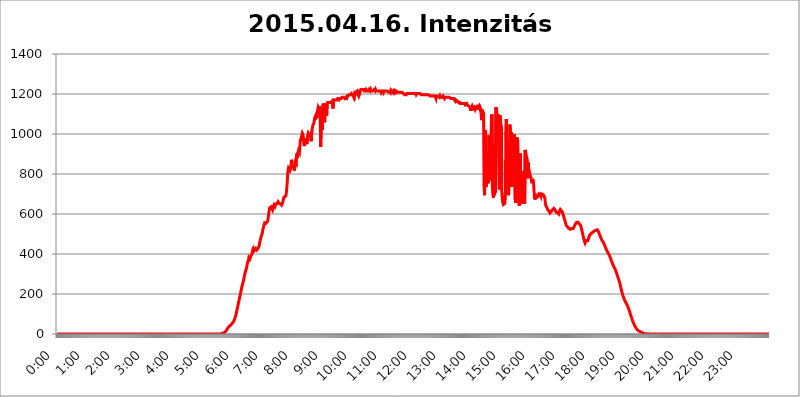
| Category | 2015.04.16. Intenzitás [W/m^2] |
|---|---|
| 0.0 | -0.256 |
| 0.0006944444444444445 | -0.256 |
| 0.001388888888888889 | -0.256 |
| 0.0020833333333333333 | -0.256 |
| 0.002777777777777778 | -0.256 |
| 0.003472222222222222 | -0.256 |
| 0.004166666666666667 | -0.256 |
| 0.004861111111111111 | -0.256 |
| 0.005555555555555556 | -0.256 |
| 0.0062499999999999995 | -0.256 |
| 0.006944444444444444 | -0.256 |
| 0.007638888888888889 | -0.256 |
| 0.008333333333333333 | -0.256 |
| 0.009027777777777779 | -0.256 |
| 0.009722222222222222 | -0.256 |
| 0.010416666666666666 | -0.256 |
| 0.011111111111111112 | -0.256 |
| 0.011805555555555555 | -0.256 |
| 0.012499999999999999 | -0.256 |
| 0.013194444444444444 | -0.256 |
| 0.013888888888888888 | -0.256 |
| 0.014583333333333332 | -0.256 |
| 0.015277777777777777 | -0.256 |
| 0.015972222222222224 | -0.256 |
| 0.016666666666666666 | -0.256 |
| 0.017361111111111112 | -0.256 |
| 0.018055555555555557 | -0.256 |
| 0.01875 | -0.256 |
| 0.019444444444444445 | -0.256 |
| 0.02013888888888889 | -0.256 |
| 0.020833333333333332 | -0.256 |
| 0.02152777777777778 | -0.256 |
| 0.022222222222222223 | -0.256 |
| 0.02291666666666667 | -0.256 |
| 0.02361111111111111 | -0.256 |
| 0.024305555555555556 | -0.256 |
| 0.024999999999999998 | -0.256 |
| 0.025694444444444447 | -0.256 |
| 0.02638888888888889 | -0.256 |
| 0.027083333333333334 | -0.256 |
| 0.027777777777777776 | -0.256 |
| 0.02847222222222222 | -0.256 |
| 0.029166666666666664 | -0.256 |
| 0.029861111111111113 | -0.256 |
| 0.030555555555555555 | -0.256 |
| 0.03125 | -0.256 |
| 0.03194444444444445 | -0.256 |
| 0.03263888888888889 | -0.256 |
| 0.03333333333333333 | -0.256 |
| 0.034027777777777775 | -0.256 |
| 0.034722222222222224 | -0.256 |
| 0.035416666666666666 | -0.256 |
| 0.036111111111111115 | -0.256 |
| 0.03680555555555556 | -0.256 |
| 0.0375 | -0.256 |
| 0.03819444444444444 | -0.256 |
| 0.03888888888888889 | -0.256 |
| 0.03958333333333333 | -0.256 |
| 0.04027777777777778 | -0.256 |
| 0.04097222222222222 | -0.256 |
| 0.041666666666666664 | -0.256 |
| 0.042361111111111106 | -0.256 |
| 0.04305555555555556 | -0.256 |
| 0.043750000000000004 | -0.256 |
| 0.044444444444444446 | -0.256 |
| 0.04513888888888889 | -0.256 |
| 0.04583333333333334 | -0.256 |
| 0.04652777777777778 | -0.256 |
| 0.04722222222222222 | -0.256 |
| 0.04791666666666666 | -0.256 |
| 0.04861111111111111 | -0.256 |
| 0.049305555555555554 | -0.256 |
| 0.049999999999999996 | -0.256 |
| 0.05069444444444445 | -0.256 |
| 0.051388888888888894 | -0.256 |
| 0.052083333333333336 | -0.256 |
| 0.05277777777777778 | -0.256 |
| 0.05347222222222222 | -0.256 |
| 0.05416666666666667 | -0.256 |
| 0.05486111111111111 | -0.256 |
| 0.05555555555555555 | -0.256 |
| 0.05625 | -0.256 |
| 0.05694444444444444 | -0.256 |
| 0.057638888888888885 | -0.256 |
| 0.05833333333333333 | -0.256 |
| 0.05902777777777778 | -0.256 |
| 0.059722222222222225 | -0.256 |
| 0.06041666666666667 | -0.256 |
| 0.061111111111111116 | -0.256 |
| 0.06180555555555556 | -0.256 |
| 0.0625 | -0.256 |
| 0.06319444444444444 | -0.256 |
| 0.06388888888888888 | -0.256 |
| 0.06458333333333334 | -0.256 |
| 0.06527777777777778 | -0.256 |
| 0.06597222222222222 | -0.256 |
| 0.06666666666666667 | -0.256 |
| 0.06736111111111111 | -0.256 |
| 0.06805555555555555 | -0.256 |
| 0.06874999999999999 | -0.256 |
| 0.06944444444444443 | -0.256 |
| 0.07013888888888889 | -0.256 |
| 0.07083333333333333 | -0.256 |
| 0.07152777777777779 | -0.256 |
| 0.07222222222222223 | -0.256 |
| 0.07291666666666667 | -0.256 |
| 0.07361111111111111 | -0.256 |
| 0.07430555555555556 | -0.256 |
| 0.075 | -0.256 |
| 0.07569444444444444 | -0.256 |
| 0.0763888888888889 | -0.256 |
| 0.07708333333333334 | -0.256 |
| 0.07777777777777778 | -0.256 |
| 0.07847222222222222 | -0.256 |
| 0.07916666666666666 | -0.256 |
| 0.0798611111111111 | -0.256 |
| 0.08055555555555556 | -0.256 |
| 0.08125 | -0.256 |
| 0.08194444444444444 | -0.256 |
| 0.08263888888888889 | -0.256 |
| 0.08333333333333333 | -0.256 |
| 0.08402777777777777 | -0.256 |
| 0.08472222222222221 | -0.256 |
| 0.08541666666666665 | -0.256 |
| 0.08611111111111112 | -0.256 |
| 0.08680555555555557 | -0.256 |
| 0.08750000000000001 | -0.256 |
| 0.08819444444444445 | -0.256 |
| 0.08888888888888889 | -0.256 |
| 0.08958333333333333 | -0.256 |
| 0.09027777777777778 | -0.256 |
| 0.09097222222222222 | -0.256 |
| 0.09166666666666667 | -0.256 |
| 0.09236111111111112 | -0.256 |
| 0.09305555555555556 | -0.256 |
| 0.09375 | -0.256 |
| 0.09444444444444444 | -0.256 |
| 0.09513888888888888 | -0.256 |
| 0.09583333333333333 | -0.256 |
| 0.09652777777777777 | -0.256 |
| 0.09722222222222222 | -0.256 |
| 0.09791666666666667 | -0.256 |
| 0.09861111111111111 | -0.256 |
| 0.09930555555555555 | -0.256 |
| 0.09999999999999999 | -0.256 |
| 0.10069444444444443 | -0.256 |
| 0.1013888888888889 | -0.256 |
| 0.10208333333333335 | -0.256 |
| 0.10277777777777779 | -0.256 |
| 0.10347222222222223 | -0.256 |
| 0.10416666666666667 | -0.256 |
| 0.10486111111111111 | -0.256 |
| 0.10555555555555556 | -0.256 |
| 0.10625 | -0.256 |
| 0.10694444444444444 | -0.256 |
| 0.1076388888888889 | -0.256 |
| 0.10833333333333334 | -0.256 |
| 0.10902777777777778 | -0.256 |
| 0.10972222222222222 | -0.256 |
| 0.1111111111111111 | -0.256 |
| 0.11180555555555556 | -0.256 |
| 0.11180555555555556 | -0.256 |
| 0.1125 | -0.256 |
| 0.11319444444444444 | -0.256 |
| 0.11388888888888889 | -0.256 |
| 0.11458333333333333 | -0.256 |
| 0.11527777777777777 | -0.256 |
| 0.11597222222222221 | -0.256 |
| 0.11666666666666665 | -0.256 |
| 0.1173611111111111 | -0.256 |
| 0.11805555555555557 | -0.256 |
| 0.11944444444444445 | -0.256 |
| 0.12013888888888889 | -0.256 |
| 0.12083333333333333 | -0.256 |
| 0.12152777777777778 | -0.256 |
| 0.12222222222222223 | -0.256 |
| 0.12291666666666667 | -0.256 |
| 0.12291666666666667 | -0.256 |
| 0.12361111111111112 | -0.256 |
| 0.12430555555555556 | -0.256 |
| 0.125 | -0.256 |
| 0.12569444444444444 | -0.256 |
| 0.12638888888888888 | -0.256 |
| 0.12708333333333333 | -0.256 |
| 0.16875 | -0.256 |
| 0.12847222222222224 | -0.256 |
| 0.12916666666666668 | -0.256 |
| 0.12986111111111112 | -0.256 |
| 0.13055555555555556 | -0.256 |
| 0.13125 | -0.256 |
| 0.13194444444444445 | -0.256 |
| 0.1326388888888889 | -0.256 |
| 0.13333333333333333 | -0.256 |
| 0.13402777777777777 | -0.256 |
| 0.13402777777777777 | -0.256 |
| 0.13472222222222222 | -0.256 |
| 0.13541666666666666 | -0.256 |
| 0.1361111111111111 | -0.256 |
| 0.13749999999999998 | -0.256 |
| 0.13819444444444443 | -0.256 |
| 0.1388888888888889 | -0.256 |
| 0.13958333333333334 | -0.256 |
| 0.14027777777777778 | -0.256 |
| 0.14097222222222222 | -0.256 |
| 0.14166666666666666 | -0.256 |
| 0.1423611111111111 | -0.256 |
| 0.14305555555555557 | -0.256 |
| 0.14375000000000002 | -0.256 |
| 0.14444444444444446 | -0.256 |
| 0.1451388888888889 | -0.256 |
| 0.1451388888888889 | -0.256 |
| 0.14652777777777778 | -0.256 |
| 0.14722222222222223 | -0.256 |
| 0.14791666666666667 | -0.256 |
| 0.1486111111111111 | -0.256 |
| 0.14930555555555555 | -0.256 |
| 0.15 | -0.256 |
| 0.15069444444444444 | -0.256 |
| 0.15138888888888888 | -0.256 |
| 0.15208333333333332 | -0.256 |
| 0.15277777777777776 | -0.256 |
| 0.15347222222222223 | -0.256 |
| 0.15416666666666667 | -0.256 |
| 0.15486111111111112 | -0.256 |
| 0.15555555555555556 | -0.256 |
| 0.15625 | -0.256 |
| 0.15694444444444444 | -0.256 |
| 0.15763888888888888 | -0.256 |
| 0.15833333333333333 | -0.256 |
| 0.15902777777777777 | -0.256 |
| 0.15972222222222224 | -0.256 |
| 0.16041666666666668 | -0.256 |
| 0.16111111111111112 | -0.256 |
| 0.16180555555555556 | -0.256 |
| 0.1625 | -0.256 |
| 0.16319444444444445 | -0.256 |
| 0.1638888888888889 | -0.256 |
| 0.16458333333333333 | -0.256 |
| 0.16527777777777777 | -0.256 |
| 0.16597222222222222 | -0.256 |
| 0.16666666666666666 | -0.256 |
| 0.1673611111111111 | -0.256 |
| 0.16805555555555554 | -0.256 |
| 0.16874999999999998 | -0.256 |
| 0.16944444444444443 | -0.256 |
| 0.17013888888888887 | -0.256 |
| 0.1708333333333333 | -0.256 |
| 0.17152777777777775 | -0.256 |
| 0.17222222222222225 | -0.256 |
| 0.1729166666666667 | -0.256 |
| 0.17361111111111113 | -0.256 |
| 0.17430555555555557 | -0.256 |
| 0.17500000000000002 | -0.256 |
| 0.17569444444444446 | -0.256 |
| 0.1763888888888889 | -0.256 |
| 0.17708333333333334 | -0.256 |
| 0.17777777777777778 | -0.256 |
| 0.17847222222222223 | -0.256 |
| 0.17916666666666667 | -0.256 |
| 0.1798611111111111 | -0.256 |
| 0.18055555555555555 | -0.256 |
| 0.18125 | -0.256 |
| 0.18194444444444444 | -0.256 |
| 0.1826388888888889 | -0.256 |
| 0.18333333333333335 | -0.256 |
| 0.1840277777777778 | -0.256 |
| 0.18472222222222223 | -0.256 |
| 0.18541666666666667 | -0.256 |
| 0.18611111111111112 | -0.256 |
| 0.18680555555555556 | -0.256 |
| 0.1875 | -0.256 |
| 0.18819444444444444 | -0.256 |
| 0.18888888888888888 | -0.256 |
| 0.18958333333333333 | -0.256 |
| 0.19027777777777777 | -0.256 |
| 0.1909722222222222 | -0.256 |
| 0.19166666666666665 | -0.256 |
| 0.19236111111111112 | -0.256 |
| 0.19305555555555554 | -0.256 |
| 0.19375 | -0.256 |
| 0.19444444444444445 | -0.256 |
| 0.1951388888888889 | -0.256 |
| 0.19583333333333333 | -0.256 |
| 0.19652777777777777 | -0.256 |
| 0.19722222222222222 | -0.256 |
| 0.19791666666666666 | -0.256 |
| 0.1986111111111111 | -0.256 |
| 0.19930555555555554 | -0.256 |
| 0.19999999999999998 | -0.256 |
| 0.20069444444444443 | -0.256 |
| 0.20138888888888887 | -0.256 |
| 0.2020833333333333 | -0.256 |
| 0.2027777777777778 | -0.256 |
| 0.2034722222222222 | -0.256 |
| 0.2041666666666667 | -0.256 |
| 0.20486111111111113 | -0.256 |
| 0.20555555555555557 | -0.256 |
| 0.20625000000000002 | -0.256 |
| 0.20694444444444446 | -0.256 |
| 0.2076388888888889 | -0.256 |
| 0.20833333333333334 | -0.256 |
| 0.20902777777777778 | -0.256 |
| 0.20972222222222223 | -0.256 |
| 0.21041666666666667 | -0.256 |
| 0.2111111111111111 | -0.256 |
| 0.21180555555555555 | -0.256 |
| 0.2125 | -0.256 |
| 0.21319444444444444 | -0.256 |
| 0.2138888888888889 | -0.256 |
| 0.21458333333333335 | -0.256 |
| 0.2152777777777778 | -0.256 |
| 0.21597222222222223 | -0.256 |
| 0.21666666666666667 | -0.256 |
| 0.21736111111111112 | -0.256 |
| 0.21805555555555556 | -0.256 |
| 0.21875 | -0.256 |
| 0.21944444444444444 | -0.256 |
| 0.22013888888888888 | -0.256 |
| 0.22083333333333333 | -0.256 |
| 0.22152777777777777 | -0.256 |
| 0.2222222222222222 | -0.256 |
| 0.22291666666666665 | -0.256 |
| 0.2236111111111111 | -0.256 |
| 0.22430555555555556 | -0.256 |
| 0.225 | -0.256 |
| 0.22569444444444445 | -0.256 |
| 0.2263888888888889 | -0.256 |
| 0.22708333333333333 | -0.256 |
| 0.22777777777777777 | 1.09 |
| 0.22847222222222222 | 1.09 |
| 0.22916666666666666 | 1.09 |
| 0.2298611111111111 | 1.09 |
| 0.23055555555555554 | 2.439 |
| 0.23124999999999998 | 2.439 |
| 0.23194444444444443 | 3.791 |
| 0.23263888888888887 | 3.791 |
| 0.2333333333333333 | 5.146 |
| 0.2340277777777778 | 6.503 |
| 0.2347222222222222 | 7.862 |
| 0.2354166666666667 | 10.589 |
| 0.23611111111111113 | 13.325 |
| 0.23680555555555557 | 16.069 |
| 0.23750000000000002 | 20.201 |
| 0.23819444444444446 | 24.35 |
| 0.2388888888888889 | 28.514 |
| 0.23958333333333334 | 31.297 |
| 0.24027777777777778 | 35.483 |
| 0.24097222222222223 | 38.28 |
| 0.24166666666666667 | 39.68 |
| 0.2423611111111111 | 42.483 |
| 0.24305555555555555 | 43.886 |
| 0.24375 | 45.29 |
| 0.24444444444444446 | 49.507 |
| 0.24513888888888888 | 52.322 |
| 0.24583333333333335 | 55.139 |
| 0.2465277777777778 | 59.368 |
| 0.24722222222222223 | 62.189 |
| 0.24791666666666667 | 67.835 |
| 0.24861111111111112 | 73.481 |
| 0.24930555555555556 | 80.536 |
| 0.25 | 88.991 |
| 0.25069444444444444 | 97.427 |
| 0.2513888888888889 | 108.629 |
| 0.2520833333333333 | 119.766 |
| 0.25277777777777777 | 132.196 |
| 0.2534722222222222 | 143.144 |
| 0.25416666666666665 | 156.678 |
| 0.2548611111111111 | 167.374 |
| 0.2555555555555556 | 179.258 |
| 0.25625000000000003 | 189.685 |
| 0.2569444444444445 | 201.258 |
| 0.2576388888888889 | 212.664 |
| 0.25833333333333336 | 225.146 |
| 0.2590277777777778 | 237.433 |
| 0.25972222222222224 | 245.925 |
| 0.2604166666666667 | 255.528 |
| 0.2611111111111111 | 266.216 |
| 0.26180555555555557 | 277.967 |
| 0.2625 | 290.777 |
| 0.26319444444444445 | 302.353 |
| 0.2638888888888889 | 311.594 |
| 0.26458333333333334 | 320.84 |
| 0.2652777777777778 | 327.793 |
| 0.2659722222222222 | 339.449 |
| 0.26666666666666666 | 354.805 |
| 0.2673611111111111 | 359.595 |
| 0.26805555555555555 | 368.07 |
| 0.26875 | 381.674 |
| 0.26944444444444443 | 381.674 |
| 0.2701388888888889 | 374.206 |
| 0.2708333333333333 | 379.171 |
| 0.27152777777777776 | 389.27 |
| 0.2722222222222222 | 393.122 |
| 0.27291666666666664 | 398.318 |
| 0.2736111111111111 | 410.283 |
| 0.2743055555555555 | 422.678 |
| 0.27499999999999997 | 428.341 |
| 0.27569444444444446 | 422.678 |
| 0.27638888888888885 | 417.112 |
| 0.27708333333333335 | 412.998 |
| 0.2777777777777778 | 421.278 |
| 0.27847222222222223 | 426.916 |
| 0.2791666666666667 | 422.678 |
| 0.2798611111111111 | 419.883 |
| 0.28055555555555556 | 422.678 |
| 0.28125 | 425.497 |
| 0.28194444444444444 | 429.773 |
| 0.2826388888888889 | 435.566 |
| 0.2833333333333333 | 444.463 |
| 0.28402777777777777 | 458.318 |
| 0.2847222222222222 | 469.557 |
| 0.28541666666666665 | 479.541 |
| 0.28611111111111115 | 489.873 |
| 0.28680555555555554 | 495.176 |
| 0.28750000000000003 | 502.396 |
| 0.2881944444444445 | 517.375 |
| 0.2888888888888889 | 531.108 |
| 0.28958333333333336 | 539.234 |
| 0.2902777777777778 | 547.572 |
| 0.29097222222222224 | 556.131 |
| 0.2916666666666667 | 558.305 |
| 0.2923611111111111 | 558.305 |
| 0.29305555555555557 | 553.97 |
| 0.29375 | 551.823 |
| 0.29444444444444445 | 556.131 |
| 0.2951388888888889 | 564.917 |
| 0.29583333333333334 | 580.866 |
| 0.2965277777777778 | 600.035 |
| 0.2972222222222222 | 617.682 |
| 0.29791666666666666 | 630.814 |
| 0.2986111111111111 | 633.495 |
| 0.29930555555555555 | 633.495 |
| 0.3 | 636.194 |
| 0.30069444444444443 | 638.912 |
| 0.3013888888888889 | 638.912 |
| 0.3020833333333333 | 620.273 |
| 0.30277777777777776 | 628.152 |
| 0.3034722222222222 | 641.649 |
| 0.30416666666666664 | 647.179 |
| 0.3048611111111111 | 644.405 |
| 0.3055555555555555 | 638.912 |
| 0.30624999999999997 | 647.179 |
| 0.3069444444444444 | 649.973 |
| 0.3076388888888889 | 649.973 |
| 0.30833333333333335 | 652.786 |
| 0.3090277777777778 | 655.618 |
| 0.30972222222222223 | 661.343 |
| 0.3104166666666667 | 658.471 |
| 0.3111111111111111 | 652.786 |
| 0.31180555555555556 | 655.618 |
| 0.3125 | 652.786 |
| 0.31319444444444444 | 649.973 |
| 0.3138888888888889 | 647.179 |
| 0.3145833333333333 | 644.405 |
| 0.31527777777777777 | 649.973 |
| 0.3159722222222222 | 649.973 |
| 0.31666666666666665 | 664.234 |
| 0.31736111111111115 | 676.003 |
| 0.31805555555555554 | 685.046 |
| 0.31875000000000003 | 688.102 |
| 0.3194444444444445 | 688.102 |
| 0.3201388888888889 | 688.102 |
| 0.32083333333333336 | 694.278 |
| 0.3215277777777778 | 713.328 |
| 0.32222222222222224 | 739.988 |
| 0.3229166666666667 | 782.842 |
| 0.3236111111111111 | 817.382 |
| 0.32430555555555557 | 829.377 |
| 0.325 | 833.43 |
| 0.32569444444444445 | 829.377 |
| 0.3263888888888889 | 817.382 |
| 0.32708333333333334 | 825.351 |
| 0.3277777777777778 | 841.619 |
| 0.3284722222222222 | 871.173 |
| 0.32916666666666666 | 854.113 |
| 0.3298611111111111 | 849.92 |
| 0.33055555555555555 | 833.43 |
| 0.33125 | 849.92 |
| 0.33194444444444443 | 825.351 |
| 0.3326388888888889 | 817.382 |
| 0.3333333333333333 | 845.755 |
| 0.3340277777777778 | 871.173 |
| 0.3347222222222222 | 837.51 |
| 0.3354166666666667 | 884.274 |
| 0.3361111111111111 | 902.16 |
| 0.3368055555555556 | 879.878 |
| 0.33749999999999997 | 906.707 |
| 0.33819444444444446 | 915.893 |
| 0.33888888888888885 | 911.285 |
| 0.33958333333333335 | 906.707 |
| 0.34027777777777773 | 939.404 |
| 0.34097222222222223 | 968.671 |
| 0.3416666666666666 | 973.663 |
| 0.3423611111111111 | 983.747 |
| 0.3430555555555555 | 993.965 |
| 0.34375 | 1004.318 |
| 0.3444444444444445 | 999.125 |
| 0.3451388888888889 | 983.747 |
| 0.3458333333333334 | 953.892 |
| 0.34652777777777777 | 939.404 |
| 0.34722222222222227 | 939.404 |
| 0.34791666666666665 | 978.688 |
| 0.34861111111111115 | 968.671 |
| 0.34930555555555554 | 963.712 |
| 0.35000000000000003 | 949.03 |
| 0.3506944444444444 | 953.892 |
| 0.3513888888888889 | 953.892 |
| 0.3520833333333333 | 1004.318 |
| 0.3527777777777778 | 1004.318 |
| 0.3534722222222222 | 1004.318 |
| 0.3541666666666667 | 993.965 |
| 0.3548611111111111 | 993.965 |
| 0.35555555555555557 | 999.125 |
| 0.35625 | 963.712 |
| 0.35694444444444445 | 1014.809 |
| 0.3576388888888889 | 1025.437 |
| 0.35833333333333334 | 1041.644 |
| 0.3590277777777778 | 1047.117 |
| 0.3597222222222222 | 1052.625 |
| 0.36041666666666666 | 1063.751 |
| 0.3611111111111111 | 1080.711 |
| 0.36180555555555555 | 1080.711 |
| 0.3625 | 1092.203 |
| 0.36319444444444443 | 1080.711 |
| 0.3638888888888889 | 1080.711 |
| 0.3645833333333333 | 1086.439 |
| 0.3652777777777778 | 1121.587 |
| 0.3659722222222222 | 1133.607 |
| 0.3666666666666667 | 1127.578 |
| 0.3673611111111111 | 1127.578 |
| 0.3680555555555556 | 1139.675 |
| 0.36874999999999997 | 1080.711 |
| 0.36944444444444446 | 934.639 |
| 0.37013888888888885 | 1030.804 |
| 0.37083333333333335 | 1041.644 |
| 0.37152777777777773 | 1020.106 |
| 0.37222222222222223 | 1127.578 |
| 0.3729166666666666 | 1151.928 |
| 0.3736111111111111 | 1127.578 |
| 0.3743055555555555 | 1069.368 |
| 0.375 | 1058.17 |
| 0.3756944444444445 | 1151.928 |
| 0.3763888888888889 | 1151.928 |
| 0.3770833333333334 | 1151.928 |
| 0.37777777777777777 | 1092.203 |
| 0.37847222222222227 | 1151.928 |
| 0.37916666666666665 | 1158.113 |
| 0.37986111111111115 | 1158.113 |
| 0.38055555555555554 | 1158.113 |
| 0.38125000000000003 | 1158.113 |
| 0.3819444444444444 | 1158.113 |
| 0.3826388888888889 | 1158.113 |
| 0.3833333333333333 | 1158.113 |
| 0.3840277777777778 | 1158.113 |
| 0.3847222222222222 | 1158.113 |
| 0.3854166666666667 | 1164.337 |
| 0.3861111111111111 | 1164.337 |
| 0.38680555555555557 | 1127.578 |
| 0.3875 | 1170.601 |
| 0.38819444444444445 | 1170.601 |
| 0.3888888888888889 | 1170.601 |
| 0.38958333333333334 | 1170.601 |
| 0.3902777777777778 | 1170.601 |
| 0.3909722222222222 | 1170.601 |
| 0.39166666666666666 | 1170.601 |
| 0.3923611111111111 | 1170.601 |
| 0.39305555555555555 | 1176.905 |
| 0.39375 | 1176.905 |
| 0.39444444444444443 | 1176.905 |
| 0.3951388888888889 | 1170.601 |
| 0.3958333333333333 | 1176.905 |
| 0.3965277777777778 | 1176.905 |
| 0.3972222222222222 | 1176.905 |
| 0.3979166666666667 | 1176.905 |
| 0.3986111111111111 | 1176.905 |
| 0.3993055555555556 | 1183.249 |
| 0.39999999999999997 | 1183.249 |
| 0.40069444444444446 | 1183.249 |
| 0.40138888888888885 | 1183.249 |
| 0.40208333333333335 | 1183.249 |
| 0.40277777777777773 | 1183.249 |
| 0.40347222222222223 | 1176.905 |
| 0.4041666666666666 | 1176.905 |
| 0.4048611111111111 | 1183.249 |
| 0.4055555555555555 | 1170.601 |
| 0.40625 | 1183.249 |
| 0.4069444444444445 | 1183.249 |
| 0.4076388888888889 | 1189.633 |
| 0.4083333333333334 | 1189.633 |
| 0.40902777777777777 | 1196.058 |
| 0.40972222222222227 | 1196.058 |
| 0.41041666666666665 | 1196.058 |
| 0.41111111111111115 | 1196.058 |
| 0.41180555555555554 | 1196.058 |
| 0.41250000000000003 | 1202.523 |
| 0.4131944444444444 | 1202.523 |
| 0.4138888888888889 | 1196.058 |
| 0.4145833333333333 | 1196.058 |
| 0.4152777777777778 | 1189.633 |
| 0.4159722222222222 | 1183.249 |
| 0.4166666666666667 | 1196.058 |
| 0.4173611111111111 | 1189.633 |
| 0.41805555555555557 | 1202.523 |
| 0.41875 | 1209.029 |
| 0.41944444444444445 | 1209.029 |
| 0.4201388888888889 | 1209.029 |
| 0.42083333333333334 | 1215.576 |
| 0.4215277777777778 | 1209.029 |
| 0.4222222222222222 | 1196.058 |
| 0.42291666666666666 | 1189.633 |
| 0.4236111111111111 | 1189.633 |
| 0.42430555555555555 | 1202.523 |
| 0.425 | 1215.576 |
| 0.42569444444444443 | 1222.164 |
| 0.4263888888888889 | 1222.164 |
| 0.4270833333333333 | 1222.164 |
| 0.4277777777777778 | 1222.164 |
| 0.4284722222222222 | 1222.164 |
| 0.4291666666666667 | 1222.164 |
| 0.4298611111111111 | 1222.164 |
| 0.4305555555555556 | 1215.576 |
| 0.43124999999999997 | 1215.576 |
| 0.43194444444444446 | 1215.576 |
| 0.43263888888888885 | 1215.576 |
| 0.43333333333333335 | 1222.164 |
| 0.43402777777777773 | 1222.164 |
| 0.43472222222222223 | 1215.576 |
| 0.4354166666666666 | 1215.576 |
| 0.4361111111111111 | 1215.576 |
| 0.4368055555555555 | 1215.576 |
| 0.4375 | 1222.164 |
| 0.4381944444444445 | 1222.164 |
| 0.4388888888888889 | 1215.576 |
| 0.4395833333333334 | 1222.164 |
| 0.44027777777777777 | 1215.576 |
| 0.44097222222222227 | 1215.576 |
| 0.44166666666666665 | 1215.576 |
| 0.44236111111111115 | 1215.576 |
| 0.44305555555555554 | 1215.576 |
| 0.44375000000000003 | 1215.576 |
| 0.4444444444444444 | 1222.164 |
| 0.4451388888888889 | 1222.164 |
| 0.4458333333333333 | 1215.576 |
| 0.4465277777777778 | 1222.164 |
| 0.4472222222222222 | 1215.576 |
| 0.4479166666666667 | 1215.576 |
| 0.4486111111111111 | 1215.576 |
| 0.44930555555555557 | 1215.576 |
| 0.45 | 1215.576 |
| 0.45069444444444445 | 1215.576 |
| 0.4513888888888889 | 1215.576 |
| 0.45208333333333334 | 1215.576 |
| 0.4527777777777778 | 1215.576 |
| 0.4534722222222222 | 1215.576 |
| 0.45416666666666666 | 1209.029 |
| 0.4548611111111111 | 1215.576 |
| 0.45555555555555555 | 1215.576 |
| 0.45625 | 1215.576 |
| 0.45694444444444443 | 1215.576 |
| 0.4576388888888889 | 1209.029 |
| 0.4583333333333333 | 1215.576 |
| 0.4590277777777778 | 1215.576 |
| 0.4597222222222222 | 1215.576 |
| 0.4604166666666667 | 1215.576 |
| 0.4611111111111111 | 1215.576 |
| 0.4618055555555556 | 1215.576 |
| 0.46249999999999997 | 1215.576 |
| 0.46319444444444446 | 1215.576 |
| 0.46388888888888885 | 1215.576 |
| 0.46458333333333335 | 1209.029 |
| 0.46527777777777773 | 1209.029 |
| 0.46597222222222223 | 1209.029 |
| 0.4666666666666666 | 1209.029 |
| 0.4673611111111111 | 1215.576 |
| 0.4680555555555555 | 1209.029 |
| 0.46875 | 1215.576 |
| 0.4694444444444445 | 1215.576 |
| 0.4701388888888889 | 1209.029 |
| 0.4708333333333334 | 1209.029 |
| 0.47152777777777777 | 1215.576 |
| 0.47222222222222227 | 1209.029 |
| 0.47291666666666665 | 1215.576 |
| 0.47361111111111115 | 1215.576 |
| 0.47430555555555554 | 1209.029 |
| 0.47500000000000003 | 1215.576 |
| 0.4756944444444444 | 1215.576 |
| 0.4763888888888889 | 1215.576 |
| 0.4770833333333333 | 1209.029 |
| 0.4777777777777778 | 1209.029 |
| 0.4784722222222222 | 1209.029 |
| 0.4791666666666667 | 1209.029 |
| 0.4798611111111111 | 1209.029 |
| 0.48055555555555557 | 1209.029 |
| 0.48125 | 1209.029 |
| 0.48194444444444445 | 1209.029 |
| 0.4826388888888889 | 1209.029 |
| 0.48333333333333334 | 1209.029 |
| 0.4840277777777778 | 1209.029 |
| 0.4847222222222222 | 1209.029 |
| 0.48541666666666666 | 1202.523 |
| 0.4861111111111111 | 1202.523 |
| 0.48680555555555555 | 1202.523 |
| 0.4875 | 1196.058 |
| 0.48819444444444443 | 1196.058 |
| 0.4888888888888889 | 1196.058 |
| 0.4895833333333333 | 1196.058 |
| 0.4902777777777778 | 1202.523 |
| 0.4909722222222222 | 1202.523 |
| 0.4916666666666667 | 1202.523 |
| 0.4923611111111111 | 1202.523 |
| 0.4930555555555556 | 1202.523 |
| 0.49374999999999997 | 1202.523 |
| 0.49444444444444446 | 1202.523 |
| 0.49513888888888885 | 1202.523 |
| 0.49583333333333335 | 1202.523 |
| 0.49652777777777773 | 1202.523 |
| 0.49722222222222223 | 1202.523 |
| 0.4979166666666666 | 1202.523 |
| 0.4986111111111111 | 1202.523 |
| 0.4993055555555555 | 1202.523 |
| 0.5 | 1202.523 |
| 0.5006944444444444 | 1202.523 |
| 0.5013888888888889 | 1202.523 |
| 0.5020833333333333 | 1202.523 |
| 0.5027777777777778 | 1202.523 |
| 0.5034722222222222 | 1196.058 |
| 0.5041666666666667 | 1196.058 |
| 0.5048611111111111 | 1202.523 |
| 0.5055555555555555 | 1202.523 |
| 0.50625 | 1202.523 |
| 0.5069444444444444 | 1202.523 |
| 0.5076388888888889 | 1202.523 |
| 0.5083333333333333 | 1202.523 |
| 0.5090277777777777 | 1202.523 |
| 0.5097222222222222 | 1202.523 |
| 0.5104166666666666 | 1196.058 |
| 0.5111111111111112 | 1196.058 |
| 0.5118055555555555 | 1196.058 |
| 0.5125000000000001 | 1196.058 |
| 0.5131944444444444 | 1196.058 |
| 0.513888888888889 | 1196.058 |
| 0.5145833333333333 | 1196.058 |
| 0.5152777777777778 | 1196.058 |
| 0.5159722222222222 | 1196.058 |
| 0.5166666666666667 | 1196.058 |
| 0.517361111111111 | 1196.058 |
| 0.5180555555555556 | 1196.058 |
| 0.5187499999999999 | 1196.058 |
| 0.5194444444444445 | 1196.058 |
| 0.5201388888888888 | 1196.058 |
| 0.5208333333333334 | 1196.058 |
| 0.5215277777777778 | 1196.058 |
| 0.5222222222222223 | 1196.058 |
| 0.5229166666666667 | 1189.633 |
| 0.5236111111111111 | 1189.633 |
| 0.5243055555555556 | 1189.633 |
| 0.525 | 1189.633 |
| 0.5256944444444445 | 1189.633 |
| 0.5263888888888889 | 1189.633 |
| 0.5270833333333333 | 1189.633 |
| 0.5277777777777778 | 1189.633 |
| 0.5284722222222222 | 1189.633 |
| 0.5291666666666667 | 1189.633 |
| 0.5298611111111111 | 1189.633 |
| 0.5305555555555556 | 1183.249 |
| 0.53125 | 1176.905 |
| 0.5319444444444444 | 1189.633 |
| 0.5326388888888889 | 1189.633 |
| 0.5333333333333333 | 1189.633 |
| 0.5340277777777778 | 1189.633 |
| 0.5347222222222222 | 1189.633 |
| 0.5354166666666667 | 1189.633 |
| 0.5361111111111111 | 1183.249 |
| 0.5368055555555555 | 1189.633 |
| 0.5375 | 1183.249 |
| 0.5381944444444444 | 1183.249 |
| 0.5388888888888889 | 1183.249 |
| 0.5395833333333333 | 1183.249 |
| 0.5402777777777777 | 1183.249 |
| 0.5409722222222222 | 1189.633 |
| 0.5416666666666666 | 1183.249 |
| 0.5423611111111112 | 1183.249 |
| 0.5430555555555555 | 1176.905 |
| 0.5437500000000001 | 1183.249 |
| 0.5444444444444444 | 1183.249 |
| 0.545138888888889 | 1183.249 |
| 0.5458333333333333 | 1183.249 |
| 0.5465277777777778 | 1183.249 |
| 0.5472222222222222 | 1183.249 |
| 0.5479166666666667 | 1183.249 |
| 0.548611111111111 | 1183.249 |
| 0.5493055555555556 | 1183.249 |
| 0.5499999999999999 | 1183.249 |
| 0.5506944444444445 | 1183.249 |
| 0.5513888888888888 | 1183.249 |
| 0.5520833333333334 | 1176.905 |
| 0.5527777777777778 | 1176.905 |
| 0.5534722222222223 | 1176.905 |
| 0.5541666666666667 | 1176.905 |
| 0.5548611111111111 | 1176.905 |
| 0.5555555555555556 | 1176.905 |
| 0.55625 | 1176.905 |
| 0.5569444444444445 | 1170.601 |
| 0.5576388888888889 | 1170.601 |
| 0.5583333333333333 | 1164.337 |
| 0.5590277777777778 | 1170.601 |
| 0.5597222222222222 | 1170.601 |
| 0.5604166666666667 | 1170.601 |
| 0.5611111111111111 | 1164.337 |
| 0.5618055555555556 | 1164.337 |
| 0.5625 | 1158.113 |
| 0.5631944444444444 | 1158.113 |
| 0.5638888888888889 | 1158.113 |
| 0.5645833333333333 | 1158.113 |
| 0.5652777777777778 | 1151.928 |
| 0.5659722222222222 | 1151.928 |
| 0.5666666666666667 | 1151.928 |
| 0.5673611111111111 | 1151.928 |
| 0.5680555555555555 | 1151.928 |
| 0.56875 | 1151.928 |
| 0.5694444444444444 | 1151.928 |
| 0.5701388888888889 | 1151.928 |
| 0.5708333333333333 | 1151.928 |
| 0.5715277777777777 | 1151.928 |
| 0.5722222222222222 | 1145.782 |
| 0.5729166666666666 | 1145.782 |
| 0.5736111111111112 | 1145.782 |
| 0.5743055555555555 | 1151.928 |
| 0.5750000000000001 | 1145.782 |
| 0.5756944444444444 | 1145.782 |
| 0.576388888888889 | 1145.782 |
| 0.5770833333333333 | 1139.675 |
| 0.5777777777777778 | 1139.675 |
| 0.5784722222222222 | 1139.675 |
| 0.5791666666666667 | 1133.607 |
| 0.579861111111111 | 1115.634 |
| 0.5805555555555556 | 1139.675 |
| 0.5812499999999999 | 1133.607 |
| 0.5819444444444445 | 1139.675 |
| 0.5826388888888888 | 1139.675 |
| 0.5833333333333334 | 1127.578 |
| 0.5840277777777778 | 1127.578 |
| 0.5847222222222223 | 1133.607 |
| 0.5854166666666667 | 1127.578 |
| 0.5861111111111111 | 1121.587 |
| 0.5868055555555556 | 1127.578 |
| 0.5875 | 1139.675 |
| 0.5881944444444445 | 1121.587 |
| 0.5888888888888889 | 1139.675 |
| 0.5895833333333333 | 1139.675 |
| 0.5902777777777778 | 1139.675 |
| 0.5909722222222222 | 1139.675 |
| 0.5916666666666667 | 1133.607 |
| 0.5923611111111111 | 1139.675 |
| 0.5930555555555556 | 1139.675 |
| 0.59375 | 1127.578 |
| 0.5944444444444444 | 1127.578 |
| 0.5951388888888889 | 1069.368 |
| 0.5958333333333333 | 1121.587 |
| 0.5965277777777778 | 1115.634 |
| 0.5972222222222222 | 1115.634 |
| 0.5979166666666667 | 1103.843 |
| 0.5986111111111111 | 739.988 |
| 0.5993055555555555 | 694.278 |
| 0.6 | 993.965 |
| 0.6006944444444444 | 1020.106 |
| 0.6013888888888889 | 736.574 |
| 0.6020833333333333 | 794.119 |
| 0.6027777777777777 | 897.643 |
| 0.6034722222222222 | 915.893 |
| 0.6041666666666666 | 753.881 |
| 0.6048611111111112 | 790.334 |
| 0.6055555555555555 | 993.965 |
| 0.6062500000000001 | 775.451 |
| 0.6069444444444444 | 768.162 |
| 0.607638888888889 | 825.351 |
| 0.6083333333333333 | 963.712 |
| 0.6090277777777778 | 1086.439 |
| 0.6097222222222222 | 1098.004 |
| 0.6104166666666667 | 729.817 |
| 0.611111111111111 | 694.278 |
| 0.6118055555555556 | 682.011 |
| 0.6124999999999999 | 706.89 |
| 0.6131944444444445 | 694.278 |
| 0.6138888888888888 | 944.201 |
| 0.6145833333333334 | 706.89 |
| 0.6152777777777778 | 1133.607 |
| 0.6159722222222223 | 1121.587 |
| 0.6166666666666667 | 1103.843 |
| 0.6173611111111111 | 1063.751 |
| 0.6180555555555556 | 1069.368 |
| 0.61875 | 1098.004 |
| 0.6194444444444445 | 1098.004 |
| 0.6201388888888889 | 723.153 |
| 0.6208333333333333 | 1092.203 |
| 0.6215277777777778 | 1063.751 |
| 0.6222222222222222 | 1047.117 |
| 0.6229166666666667 | 1036.206 |
| 0.6236111111111111 | 706.89 |
| 0.6243055555555556 | 670.078 |
| 0.625 | 655.618 |
| 0.6256944444444444 | 647.179 |
| 0.6263888888888889 | 647.179 |
| 0.6270833333333333 | 649.973 |
| 0.6277777777777778 | 652.786 |
| 0.6284722222222222 | 688.102 |
| 0.6291666666666667 | 1009.546 |
| 0.6298611111111111 | 1075.021 |
| 0.6305555555555555 | 723.153 |
| 0.63125 | 700.54 |
| 0.6319444444444444 | 779.134 |
| 0.6326388888888889 | 694.278 |
| 0.6333333333333333 | 703.704 |
| 0.6340277777777777 | 706.89 |
| 0.6347222222222222 | 1047.117 |
| 0.6354166666666666 | 1020.106 |
| 0.6361111111111112 | 999.125 |
| 0.6368055555555555 | 1009.546 |
| 0.6375000000000001 | 736.574 |
| 0.6381944444444444 | 849.92 |
| 0.638888888888889 | 978.688 |
| 0.6395833333333333 | 983.747 |
| 0.6402777777777778 | 993.965 |
| 0.6409722222222222 | 999.125 |
| 0.6416666666666667 | 999.125 |
| 0.642361111111111 | 670.078 |
| 0.6430555555555556 | 655.618 |
| 0.6437499999999999 | 678.997 |
| 0.6444444444444445 | 983.747 |
| 0.6451388888888888 | 983.747 |
| 0.6458333333333334 | 963.712 |
| 0.6465277777777778 | 854.113 |
| 0.6472222222222223 | 658.471 |
| 0.6479166666666667 | 641.649 |
| 0.6486111111111111 | 652.786 |
| 0.6493055555555556 | 902.16 |
| 0.65 | 779.134 |
| 0.6506944444444445 | 649.973 |
| 0.6513888888888889 | 678.997 |
| 0.6520833333333333 | 813.439 |
| 0.6527777777777778 | 658.471 |
| 0.6534722222222222 | 649.973 |
| 0.6541666666666667 | 649.973 |
| 0.6548611111111111 | 713.328 |
| 0.6555555555555556 | 652.786 |
| 0.65625 | 920.533 |
| 0.6569444444444444 | 911.285 |
| 0.6576388888888889 | 893.157 |
| 0.6583333333333333 | 884.274 |
| 0.6590277777777778 | 875.511 |
| 0.6597222222222222 | 779.134 |
| 0.6604166666666667 | 858.335 |
| 0.6611111111111111 | 829.377 |
| 0.6618055555555555 | 825.351 |
| 0.6625 | 805.632 |
| 0.6631944444444444 | 801.768 |
| 0.6638888888888889 | 786.575 |
| 0.6645833333333333 | 779.134 |
| 0.6652777777777777 | 779.134 |
| 0.6659722222222222 | 753.881 |
| 0.6666666666666666 | 775.451 |
| 0.6673611111111111 | 779.134 |
| 0.6680555555555556 | 753.881 |
| 0.6687500000000001 | 713.328 |
| 0.6694444444444444 | 673.03 |
| 0.6701388888888888 | 670.078 |
| 0.6708333333333334 | 676.003 |
| 0.6715277777777778 | 688.102 |
| 0.6722222222222222 | 682.011 |
| 0.6729166666666666 | 678.997 |
| 0.6736111111111112 | 678.997 |
| 0.6743055555555556 | 688.102 |
| 0.6749999999999999 | 694.278 |
| 0.6756944444444444 | 700.54 |
| 0.6763888888888889 | 700.54 |
| 0.6770833333333334 | 700.54 |
| 0.6777777777777777 | 694.278 |
| 0.6784722222222223 | 688.102 |
| 0.6791666666666667 | 700.54 |
| 0.6798611111111111 | 700.54 |
| 0.6805555555555555 | 700.54 |
| 0.68125 | 697.399 |
| 0.6819444444444445 | 694.278 |
| 0.6826388888888889 | 691.18 |
| 0.6833333333333332 | 685.046 |
| 0.6840277777777778 | 676.003 |
| 0.6847222222222222 | 652.786 |
| 0.6854166666666667 | 638.912 |
| 0.686111111111111 | 638.912 |
| 0.6868055555555556 | 633.495 |
| 0.6875 | 622.881 |
| 0.6881944444444444 | 622.881 |
| 0.688888888888889 | 622.881 |
| 0.6895833333333333 | 615.11 |
| 0.6902777777777778 | 610.016 |
| 0.6909722222222222 | 604.992 |
| 0.6916666666666668 | 604.992 |
| 0.6923611111111111 | 610.016 |
| 0.6930555555555555 | 612.554 |
| 0.69375 | 617.682 |
| 0.6944444444444445 | 620.273 |
| 0.6951388888888889 | 622.881 |
| 0.6958333333333333 | 622.881 |
| 0.6965277777777777 | 628.152 |
| 0.6972222222222223 | 625.508 |
| 0.6979166666666666 | 622.881 |
| 0.6986111111111111 | 617.682 |
| 0.6993055555555556 | 610.016 |
| 0.7000000000000001 | 607.495 |
| 0.7006944444444444 | 607.495 |
| 0.7013888888888888 | 607.495 |
| 0.7020833333333334 | 604.992 |
| 0.7027777777777778 | 604.992 |
| 0.7034722222222222 | 600.035 |
| 0.7041666666666666 | 604.992 |
| 0.7048611111111112 | 617.682 |
| 0.7055555555555556 | 622.881 |
| 0.7062499999999999 | 622.881 |
| 0.7069444444444444 | 620.273 |
| 0.7076388888888889 | 615.11 |
| 0.7083333333333334 | 610.016 |
| 0.7090277777777777 | 602.505 |
| 0.7097222222222223 | 595.145 |
| 0.7104166666666667 | 587.934 |
| 0.7111111111111111 | 578.542 |
| 0.7118055555555555 | 569.398 |
| 0.7125 | 560.495 |
| 0.7131944444444445 | 551.823 |
| 0.7138888888888889 | 543.376 |
| 0.7145833333333332 | 539.234 |
| 0.7152777777777778 | 537.182 |
| 0.7159722222222222 | 533.12 |
| 0.7166666666666667 | 533.12 |
| 0.717361111111111 | 529.108 |
| 0.7180555555555556 | 527.122 |
| 0.71875 | 525.148 |
| 0.7194444444444444 | 523.186 |
| 0.720138888888889 | 523.186 |
| 0.7208333333333333 | 523.186 |
| 0.7215277777777778 | 527.122 |
| 0.7222222222222222 | 523.186 |
| 0.7229166666666668 | 529.108 |
| 0.7236111111111111 | 527.122 |
| 0.7243055555555555 | 531.108 |
| 0.725 | 537.182 |
| 0.7256944444444445 | 543.376 |
| 0.7263888888888889 | 547.572 |
| 0.7270833333333333 | 551.823 |
| 0.7277777777777777 | 556.131 |
| 0.7284722222222223 | 558.305 |
| 0.7291666666666666 | 560.495 |
| 0.7298611111111111 | 558.305 |
| 0.7305555555555556 | 558.305 |
| 0.7312500000000001 | 556.131 |
| 0.7319444444444444 | 551.823 |
| 0.7326388888888888 | 549.691 |
| 0.7333333333333334 | 547.572 |
| 0.7340277777777778 | 543.376 |
| 0.7347222222222222 | 535.145 |
| 0.7354166666666666 | 523.186 |
| 0.7361111111111112 | 513.561 |
| 0.7368055555555556 | 504.229 |
| 0.7374999999999999 | 491.63 |
| 0.7381944444444444 | 479.541 |
| 0.7388888888888889 | 471.198 |
| 0.7395833333333334 | 461.486 |
| 0.7402777777777777 | 455.184 |
| 0.7409722222222223 | 461.486 |
| 0.7416666666666667 | 461.486 |
| 0.7423611111111111 | 467.925 |
| 0.7430555555555555 | 472.848 |
| 0.74375 | 471.198 |
| 0.7444444444444445 | 467.925 |
| 0.7451388888888889 | 467.925 |
| 0.7458333333333332 | 486.389 |
| 0.7465277777777778 | 493.398 |
| 0.7472222222222222 | 495.176 |
| 0.7479166666666667 | 498.764 |
| 0.748611111111111 | 500.575 |
| 0.7493055555555556 | 504.229 |
| 0.75 | 507.927 |
| 0.7506944444444444 | 507.927 |
| 0.751388888888889 | 509.793 |
| 0.7520833333333333 | 511.671 |
| 0.7527777777777778 | 513.561 |
| 0.7534722222222222 | 515.462 |
| 0.7541666666666668 | 515.462 |
| 0.7548611111111111 | 515.462 |
| 0.7555555555555555 | 519.3 |
| 0.75625 | 523.186 |
| 0.7569444444444445 | 523.186 |
| 0.7576388888888889 | 521.237 |
| 0.7583333333333333 | 517.375 |
| 0.7590277777777777 | 511.671 |
| 0.7597222222222223 | 506.072 |
| 0.7604166666666666 | 498.764 |
| 0.7611111111111111 | 493.398 |
| 0.7618055555555556 | 486.389 |
| 0.7625000000000001 | 481.238 |
| 0.7631944444444444 | 474.507 |
| 0.7638888888888888 | 467.925 |
| 0.7645833333333334 | 464.688 |
| 0.7652777777777778 | 461.486 |
| 0.7659722222222222 | 458.318 |
| 0.7666666666666666 | 453.629 |
| 0.7673611111111112 | 445.971 |
| 0.7680555555555556 | 439.982 |
| 0.7687499999999999 | 434.107 |
| 0.7694444444444444 | 429.773 |
| 0.7701388888888889 | 422.678 |
| 0.7708333333333334 | 417.112 |
| 0.7715277777777777 | 414.364 |
| 0.7722222222222223 | 407.589 |
| 0.7729166666666667 | 403.587 |
| 0.7736111111111111 | 398.318 |
| 0.7743055555555555 | 393.122 |
| 0.775 | 386.723 |
| 0.7756944444444445 | 381.674 |
| 0.7763888888888889 | 374.206 |
| 0.7770833333333332 | 366.851 |
| 0.7777777777777778 | 360.798 |
| 0.7784722222222222 | 353.613 |
| 0.7791666666666667 | 347.682 |
| 0.779861111111111 | 341.794 |
| 0.7805555555555556 | 335.941 |
| 0.78125 | 332.443 |
| 0.7819444444444444 | 327.793 |
| 0.782638888888889 | 321.998 |
| 0.7833333333333333 | 316.215 |
| 0.7840277777777778 | 309.284 |
| 0.7847222222222222 | 302.353 |
| 0.7854166666666668 | 294.255 |
| 0.7861111111111111 | 286.13 |
| 0.7868055555555555 | 279.136 |
| 0.7875 | 272.106 |
| 0.7881944444444445 | 263.851 |
| 0.7888888888888889 | 255.528 |
| 0.7895833333333333 | 245.925 |
| 0.7902777777777777 | 234.99 |
| 0.7909722222222223 | 223.906 |
| 0.7916666666666666 | 212.664 |
| 0.7923611111111111 | 203.807 |
| 0.7930555555555556 | 194.849 |
| 0.7937500000000001 | 188.389 |
| 0.7944444444444444 | 180.569 |
| 0.7951388888888888 | 175.315 |
| 0.7958333333333334 | 168.703 |
| 0.7965277777777778 | 163.378 |
| 0.7972222222222222 | 159.364 |
| 0.7979166666666666 | 153.986 |
| 0.7986111111111112 | 148.579 |
| 0.7993055555555556 | 144.506 |
| 0.7999999999999999 | 139.051 |
| 0.8006944444444444 | 133.57 |
| 0.8013888888888889 | 126.685 |
| 0.8020833333333334 | 118.378 |
| 0.8027777777777777 | 111.42 |
| 0.8034722222222223 | 103.035 |
| 0.8041666666666667 | 96.022 |
| 0.8048611111111111 | 87.583 |
| 0.8055555555555555 | 80.536 |
| 0.80625 | 73.481 |
| 0.8069444444444445 | 66.423 |
| 0.8076388888888889 | 59.368 |
| 0.8083333333333332 | 53.73 |
| 0.8090277777777778 | 48.1 |
| 0.8097222222222222 | 42.483 |
| 0.8104166666666667 | 38.28 |
| 0.811111111111111 | 34.086 |
| 0.8118055555555556 | 29.905 |
| 0.8125 | 25.736 |
| 0.8131944444444444 | 22.965 |
| 0.813888888888889 | 20.201 |
| 0.8145833333333333 | 18.822 |
| 0.8152777777777778 | 16.069 |
| 0.8159722222222222 | 14.696 |
| 0.8166666666666668 | 13.325 |
| 0.8173611111111111 | 11.956 |
| 0.8180555555555555 | 10.589 |
| 0.81875 | 9.225 |
| 0.8194444444444445 | 7.862 |
| 0.8201388888888889 | 6.503 |
| 0.8208333333333333 | 5.146 |
| 0.8215277777777777 | 5.146 |
| 0.8222222222222223 | 3.791 |
| 0.8229166666666666 | 3.791 |
| 0.8236111111111111 | 2.439 |
| 0.8243055555555556 | 1.09 |
| 0.8250000000000001 | 1.09 |
| 0.8256944444444444 | 1.09 |
| 0.8263888888888888 | 1.09 |
| 0.8270833333333334 | 1.09 |
| 0.8277777777777778 | -0.256 |
| 0.8284722222222222 | -0.256 |
| 0.8291666666666666 | -0.256 |
| 0.8298611111111112 | -0.256 |
| 0.8305555555555556 | -0.256 |
| 0.8312499999999999 | -0.256 |
| 0.8319444444444444 | -0.256 |
| 0.8326388888888889 | -0.256 |
| 0.8333333333333334 | -0.256 |
| 0.8340277777777777 | -0.256 |
| 0.8347222222222223 | -0.256 |
| 0.8354166666666667 | -0.256 |
| 0.8361111111111111 | -0.256 |
| 0.8368055555555555 | -0.256 |
| 0.8375 | -0.256 |
| 0.8381944444444445 | -0.256 |
| 0.8388888888888889 | -0.256 |
| 0.8395833333333332 | -0.256 |
| 0.8402777777777778 | -0.256 |
| 0.8409722222222222 | -0.256 |
| 0.8416666666666667 | -0.256 |
| 0.842361111111111 | -0.256 |
| 0.8430555555555556 | -0.256 |
| 0.84375 | -0.256 |
| 0.8444444444444444 | -0.256 |
| 0.845138888888889 | -0.256 |
| 0.8458333333333333 | -0.256 |
| 0.8465277777777778 | -0.256 |
| 0.8472222222222222 | -0.256 |
| 0.8479166666666668 | -0.256 |
| 0.8486111111111111 | -0.256 |
| 0.8493055555555555 | -0.256 |
| 0.85 | -0.256 |
| 0.8506944444444445 | -0.256 |
| 0.8513888888888889 | -0.256 |
| 0.8520833333333333 | -0.256 |
| 0.8527777777777777 | -0.256 |
| 0.8534722222222223 | -0.256 |
| 0.8541666666666666 | -0.256 |
| 0.8548611111111111 | -0.256 |
| 0.8555555555555556 | -0.256 |
| 0.8562500000000001 | -0.256 |
| 0.8569444444444444 | -0.256 |
| 0.8576388888888888 | -0.256 |
| 0.8583333333333334 | -0.256 |
| 0.8590277777777778 | -0.256 |
| 0.8597222222222222 | -0.256 |
| 0.8604166666666666 | -0.256 |
| 0.8611111111111112 | -0.256 |
| 0.8618055555555556 | -0.256 |
| 0.8624999999999999 | -0.256 |
| 0.8631944444444444 | -0.256 |
| 0.8638888888888889 | -0.256 |
| 0.8645833333333334 | -0.256 |
| 0.8652777777777777 | -0.256 |
| 0.8659722222222223 | -0.256 |
| 0.8666666666666667 | -0.256 |
| 0.8673611111111111 | -0.256 |
| 0.8680555555555555 | -0.256 |
| 0.86875 | -0.256 |
| 0.8694444444444445 | -0.256 |
| 0.8701388888888889 | -0.256 |
| 0.8708333333333332 | -0.256 |
| 0.8715277777777778 | -0.256 |
| 0.8722222222222222 | -0.256 |
| 0.8729166666666667 | -0.256 |
| 0.873611111111111 | -0.256 |
| 0.8743055555555556 | -0.256 |
| 0.875 | -0.256 |
| 0.8756944444444444 | -0.256 |
| 0.876388888888889 | -0.256 |
| 0.8770833333333333 | -0.256 |
| 0.8777777777777778 | -0.256 |
| 0.8784722222222222 | -0.256 |
| 0.8791666666666668 | -0.256 |
| 0.8798611111111111 | -0.256 |
| 0.8805555555555555 | -0.256 |
| 0.88125 | -0.256 |
| 0.8819444444444445 | -0.256 |
| 0.8826388888888889 | -0.256 |
| 0.8833333333333333 | -0.256 |
| 0.8840277777777777 | -0.256 |
| 0.8847222222222223 | -0.256 |
| 0.8854166666666666 | -0.256 |
| 0.8861111111111111 | -0.256 |
| 0.8868055555555556 | -0.256 |
| 0.8875000000000001 | -0.256 |
| 0.8881944444444444 | -0.256 |
| 0.8888888888888888 | -0.256 |
| 0.8895833333333334 | -0.256 |
| 0.8902777777777778 | -0.256 |
| 0.8909722222222222 | -0.256 |
| 0.8916666666666666 | -0.256 |
| 0.8923611111111112 | -0.256 |
| 0.8930555555555556 | -0.256 |
| 0.8937499999999999 | -0.256 |
| 0.8944444444444444 | -0.256 |
| 0.8951388888888889 | -0.256 |
| 0.8958333333333334 | -0.256 |
| 0.8965277777777777 | -0.256 |
| 0.8972222222222223 | -0.256 |
| 0.8979166666666667 | -0.256 |
| 0.8986111111111111 | -0.256 |
| 0.8993055555555555 | -0.256 |
| 0.9 | -0.256 |
| 0.9006944444444445 | -0.256 |
| 0.9013888888888889 | -0.256 |
| 0.9020833333333332 | -0.256 |
| 0.9027777777777778 | -0.256 |
| 0.9034722222222222 | -0.256 |
| 0.9041666666666667 | -0.256 |
| 0.904861111111111 | -0.256 |
| 0.9055555555555556 | -0.256 |
| 0.90625 | -0.256 |
| 0.9069444444444444 | -0.256 |
| 0.907638888888889 | -0.256 |
| 0.9083333333333333 | -0.256 |
| 0.9090277777777778 | -0.256 |
| 0.9097222222222222 | -0.256 |
| 0.9104166666666668 | -0.256 |
| 0.9111111111111111 | -0.256 |
| 0.9118055555555555 | -0.256 |
| 0.9125 | -0.256 |
| 0.9131944444444445 | -0.256 |
| 0.9138888888888889 | -0.256 |
| 0.9145833333333333 | -0.256 |
| 0.9152777777777777 | -0.256 |
| 0.9159722222222223 | -0.256 |
| 0.9166666666666666 | -0.256 |
| 0.9173611111111111 | -0.256 |
| 0.9180555555555556 | -0.256 |
| 0.9187500000000001 | -0.256 |
| 0.9194444444444444 | -0.256 |
| 0.9201388888888888 | -0.256 |
| 0.9208333333333334 | -0.256 |
| 0.9215277777777778 | -0.256 |
| 0.9222222222222222 | -0.256 |
| 0.9229166666666666 | -0.256 |
| 0.9236111111111112 | -0.256 |
| 0.9243055555555556 | -0.256 |
| 0.9249999999999999 | -0.256 |
| 0.9256944444444444 | -0.256 |
| 0.9263888888888889 | -0.256 |
| 0.9270833333333334 | -0.256 |
| 0.9277777777777777 | -0.256 |
| 0.9284722222222223 | -0.256 |
| 0.9291666666666667 | -0.256 |
| 0.9298611111111111 | -0.256 |
| 0.9305555555555555 | -0.256 |
| 0.93125 | -0.256 |
| 0.9319444444444445 | -0.256 |
| 0.9326388888888889 | -0.256 |
| 0.9333333333333332 | -0.256 |
| 0.9340277777777778 | -0.256 |
| 0.9347222222222222 | -0.256 |
| 0.9354166666666667 | -0.256 |
| 0.936111111111111 | -0.256 |
| 0.9368055555555556 | -0.256 |
| 0.9375 | -0.256 |
| 0.9381944444444444 | -0.256 |
| 0.938888888888889 | -0.256 |
| 0.9395833333333333 | -0.256 |
| 0.9402777777777778 | -0.256 |
| 0.9409722222222222 | -0.256 |
| 0.9416666666666668 | -0.256 |
| 0.9423611111111111 | -0.256 |
| 0.9430555555555555 | -0.256 |
| 0.94375 | -0.256 |
| 0.9444444444444445 | -0.256 |
| 0.9451388888888889 | -0.256 |
| 0.9458333333333333 | -0.256 |
| 0.9465277777777777 | -0.256 |
| 0.9472222222222223 | -0.256 |
| 0.9479166666666666 | -0.256 |
| 0.9486111111111111 | -0.256 |
| 0.9493055555555556 | -0.256 |
| 0.9500000000000001 | -0.256 |
| 0.9506944444444444 | -0.256 |
| 0.9513888888888888 | -0.256 |
| 0.9520833333333334 | -0.256 |
| 0.9527777777777778 | -0.256 |
| 0.9534722222222222 | -0.256 |
| 0.9541666666666666 | -0.256 |
| 0.9548611111111112 | -0.256 |
| 0.9555555555555556 | -0.256 |
| 0.9562499999999999 | -0.256 |
| 0.9569444444444444 | -0.256 |
| 0.9576388888888889 | -0.256 |
| 0.9583333333333334 | -0.256 |
| 0.9590277777777777 | -0.256 |
| 0.9597222222222223 | -0.256 |
| 0.9604166666666667 | -0.256 |
| 0.9611111111111111 | -0.256 |
| 0.9618055555555555 | -0.256 |
| 0.9625 | -0.256 |
| 0.9631944444444445 | -0.256 |
| 0.9638888888888889 | -0.256 |
| 0.9645833333333332 | -0.256 |
| 0.9652777777777778 | -0.256 |
| 0.9659722222222222 | -0.256 |
| 0.9666666666666667 | -0.256 |
| 0.967361111111111 | -0.256 |
| 0.9680555555555556 | -0.256 |
| 0.96875 | -0.256 |
| 0.9694444444444444 | -0.256 |
| 0.970138888888889 | -0.256 |
| 0.9708333333333333 | -0.256 |
| 0.9715277777777778 | -0.256 |
| 0.9722222222222222 | -0.256 |
| 0.9729166666666668 | -0.256 |
| 0.9736111111111111 | -0.256 |
| 0.9743055555555555 | -0.256 |
| 0.975 | -0.256 |
| 0.9756944444444445 | -0.256 |
| 0.9763888888888889 | -0.256 |
| 0.9770833333333333 | -0.256 |
| 0.9777777777777777 | -0.256 |
| 0.9784722222222223 | -0.256 |
| 0.9791666666666666 | -0.256 |
| 0.9798611111111111 | -0.256 |
| 0.9805555555555556 | -0.256 |
| 0.9812500000000001 | -0.256 |
| 0.9819444444444444 | -0.256 |
| 0.9826388888888888 | -0.256 |
| 0.9833333333333334 | -0.256 |
| 0.9840277777777778 | -0.256 |
| 0.9847222222222222 | -0.256 |
| 0.9854166666666666 | -0.256 |
| 0.9861111111111112 | -0.256 |
| 0.9868055555555556 | -0.256 |
| 0.9874999999999999 | -0.256 |
| 0.9881944444444444 | -0.256 |
| 0.9888888888888889 | -0.256 |
| 0.9895833333333334 | -0.256 |
| 0.9902777777777777 | -0.256 |
| 0.9909722222222223 | -0.256 |
| 0.9916666666666667 | -0.256 |
| 0.9923611111111111 | -0.256 |
| 0.9930555555555555 | -0.256 |
| 0.99375 | -0.256 |
| 0.9944444444444445 | -0.256 |
| 0.9951388888888889 | -0.256 |
| 0.9958333333333332 | -0.256 |
| 0.9965277777777778 | -0.256 |
| 0.9972222222222222 | -0.256 |
| 0.9979166666666667 | -0.256 |
| 0.998611111111111 | -0.256 |
| 0.9993055555555556 | 0 |